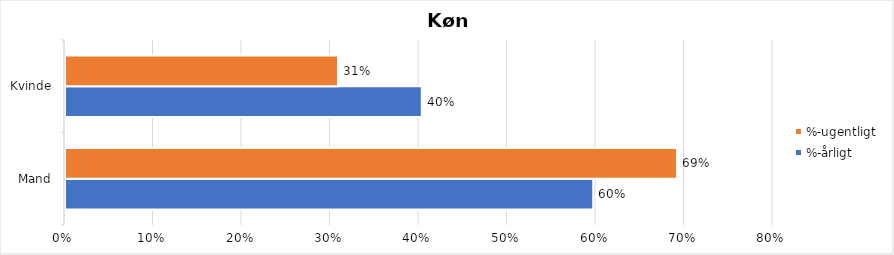
| Category | %-årligt | %-ugentligt |
|---|---|---|
| Mand | 0.597 | 0.692 |
| Kvinde | 0.403 | 0.308 |